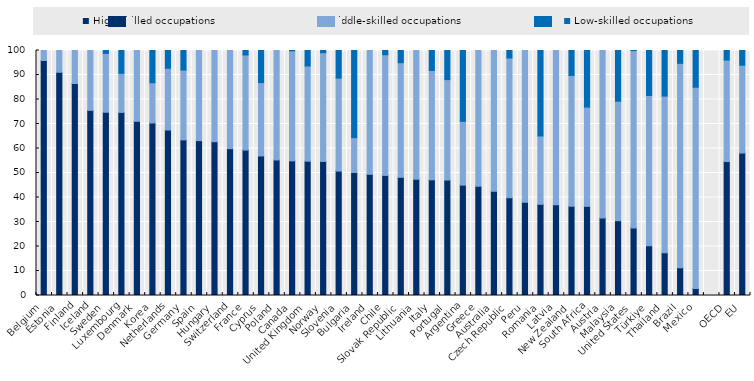
| Category | High-skilled occupations | Middle-skilled occupations | Low-skilled occupations |
|---|---|---|---|
| Belgium | 95.926 | 4.074 | 0 |
| Estonia | 91.111 | 8.889 | 0 |
| Finland | 86.523 | 13.477 | 0 |
| Iceland | 75.567 | 24.433 | 0 |
| Sweden | 74.789 | 24.023 | 1.188 |
| Luxembourg | 74.734 | 15.972 | 9.295 |
| Denmark | 71.105 | 28.895 | 0 |
| Korea | 70.405 | 16.451 | 13.144 |
| Netherlands | 67.547 | 25.188 | 7.265 |
| Germany | 63.511 | 28.494 | 7.995 |
| Spain | 63.208 | 36.792 | 0 |
| Hungary | 62.759 | 37.241 | 0 |
| Switzerland | 59.931 | 40.069 | 0 |
| France | 59.365 | 38.807 | 1.828 |
| Cyprus | 56.961 | 29.948 | 13.091 |
| Poland | 55.324 | 44.676 | 0 |
| Canada | 54.954 | 44.911 | 0.135 |
| United Kingdom | 54.821 | 38.858 | 6.321 |
| Norway | 54.714 | 44.383 | 0.903 |
| Slovenia | 50.766 | 37.953 | 11.281 |
| Bulgaria | 50.183 | 14.25 | 35.568 |
| Ireland | 49.465 | 50.535 | 0 |
| Chile | 49.014 | 49.255 | 1.731 |
| Slovak Republic | 48.237 | 46.78 | 4.983 |
| Lithuania | 47.496 | 52.504 | 0 |
| Italy | 47.217 | 44.634 | 8.149 |
| Portugal | 47.113 | 41.006 | 11.881 |
| Argentina | 45.055 | 26.039 | 28.906 |
| Greece | 44.633 | 55.367 | 0 |
| Australia | 42.572 | 57.428 | 0 |
| Czech Republic | 39.877 | 57.066 | 3.057 |
| Peru | 38.055 | 61.945 | 0 |
| Romania | 37.216 | 27.906 | 34.877 |
| Latvia | 37.056 | 62.944 | 0 |
| New Zealand | 36.405 | 53.422 | 10.172 |
| South Africa | 36.392 | 40.504 | 23.104 |
| Austria | 31.627 | 68.373 | 0 |
| Malaysia | 30.524 | 48.786 | 20.689 |
| United States | 27.59 | 72.362 | 0.047 |
| Türkiye | 20.326 | 61.324 | 18.35 |
| Thailand | 17.416 | 63.985 | 18.599 |
| Brazil | 11.346 | 83.423 | 5.231 |
| Mexico | 2.903 | 82.111 | 14.986 |
|  | 0 | 0 | 0 |
| OECD | 54.664 | 41.432 | 6.985 |
| EU | 58.15 | 35.832 | 11.574 |